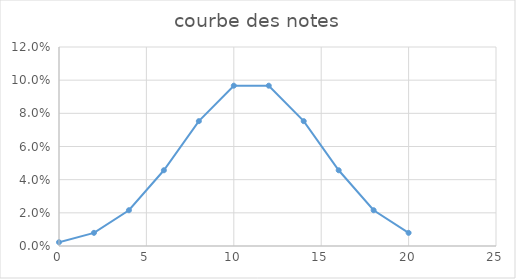
| Category | Series 0 |
|---|---|
| 0.0 | 0.002 |
| 2.0 | 0.008 |
| 4.0 | 0.022 |
| 6.0 | 0.046 |
| 8.0 | 0.075 |
| 10.0 | 0.097 |
| 12.0 | 0.097 |
| 14.0 | 0.075 |
| 16.0 | 0.046 |
| 18.0 | 0.022 |
| 20.0 | 0.008 |